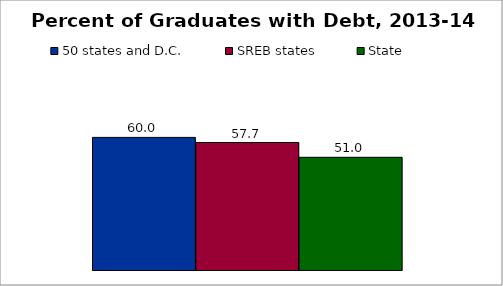
| Category | 50 states and D.C. | SREB states | State |
|---|---|---|---|
| 0 | 60 | 57.687 | 51 |